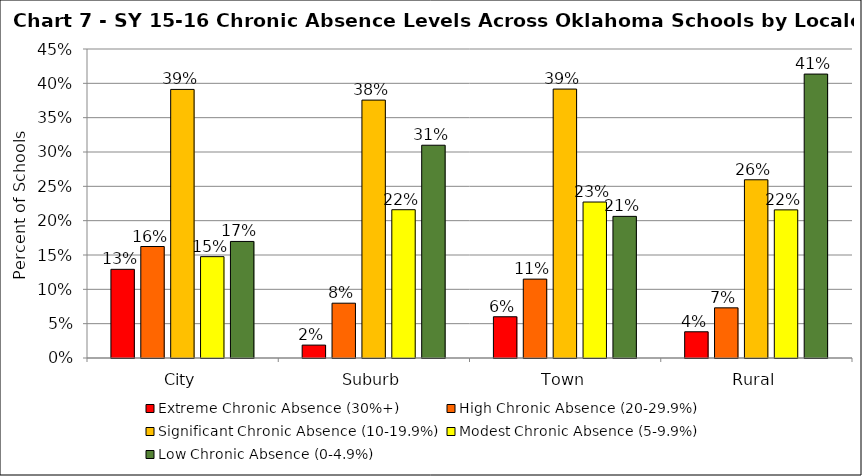
| Category | Extreme Chronic Absence (30%+) | High Chronic Absence (20-29.9%) | Significant Chronic Absence (10-19.9%) | Modest Chronic Absence (5-9.9%) | Low Chronic Absence (0-4.9%) |
|---|---|---|---|---|---|
| 0 | 0.129 | 0.162 | 0.391 | 0.148 | 0.17 |
| 1 | 0.019 | 0.08 | 0.376 | 0.216 | 0.31 |
| 2 | 0.06 | 0.115 | 0.392 | 0.227 | 0.206 |
| 3 | 0.038 | 0.073 | 0.26 | 0.216 | 0.413 |